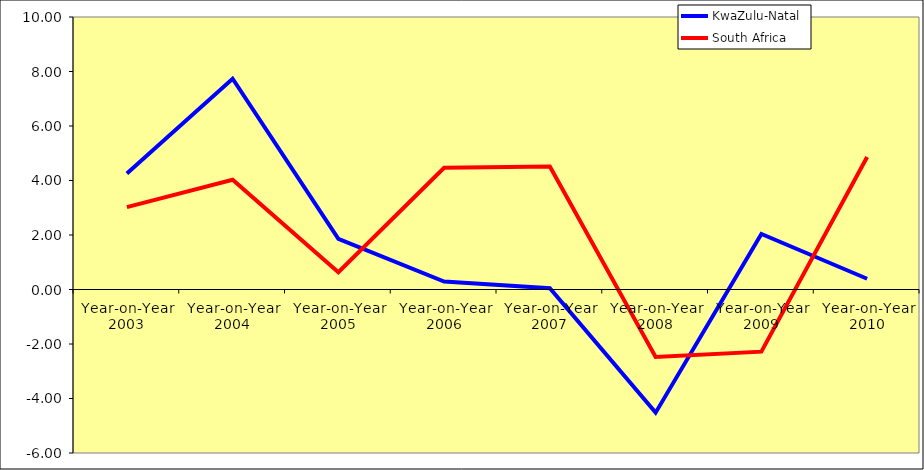
| Category | KwaZulu-Natal | South Africa |
|---|---|---|
| Year-on-Year 2003 | 4.255 | 3.023 |
| Year-on-Year 2004 | 7.734 | 4.027 |
| Year-on-Year 2005 | 1.857 | 0.632 |
| Year-on-Year 2006 | 0.29 | 4.465 |
| Year-on-Year 2007 | 0.044 | 4.517 |
| Year-on-Year 2008 | -4.519 | -2.478 |
| Year-on-Year 2009 | 2.037 | -2.281 |
| Year-on-Year 2010 | 0.394 | 4.86 |